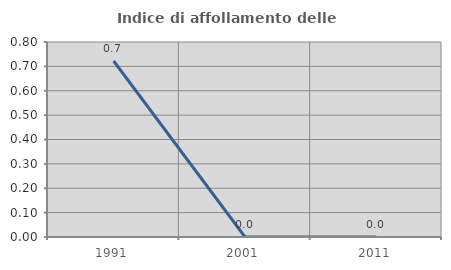
| Category | Indice di affollamento delle abitazioni  |
|---|---|
| 1991.0 | 0.722 |
| 2001.0 | 0 |
| 2011.0 | 0 |